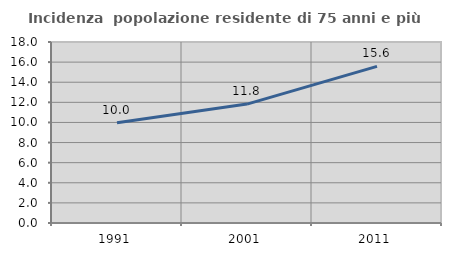
| Category | Incidenza  popolazione residente di 75 anni e più |
|---|---|
| 1991.0 | 9.965 |
| 2001.0 | 11.827 |
| 2011.0 | 15.581 |